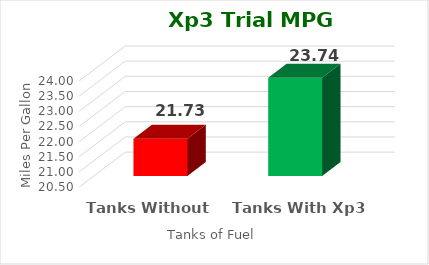
| Category | Series 0 |
|---|---|
| Tanks Without Xp3 | 21.73 |
| Tanks With Xp3 | 23.74 |